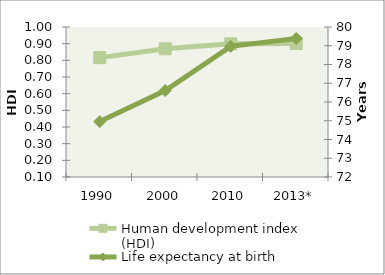
| Category | Human development index (HDI) |
|---|---|
| 1990 | 0.816 |
| 2000 | 0.869 |
| 2010 | 0.899 |
| 2013* | 0.901 |